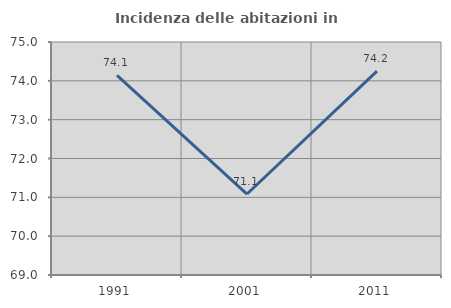
| Category | Incidenza delle abitazioni in proprietà  |
|---|---|
| 1991.0 | 74.141 |
| 2001.0 | 71.085 |
| 2011.0 | 74.25 |